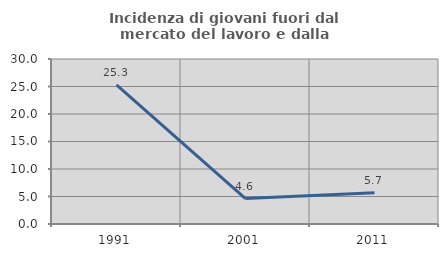
| Category | Incidenza di giovani fuori dal mercato del lavoro e dalla formazione  |
|---|---|
| 1991.0 | 25.301 |
| 2001.0 | 4.615 |
| 2011.0 | 5.66 |